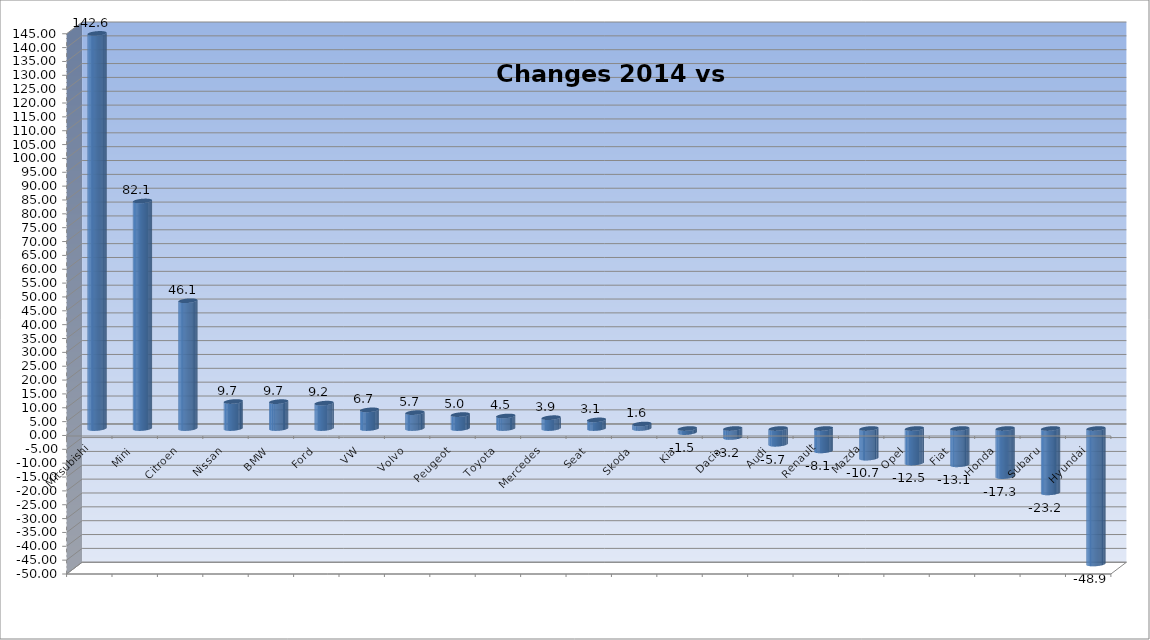
| Category | Ytd 2015 |
|---|---|
| Mitsubishi | 142.623 |
| Mini | 82.143 |
| Citroen | 46.127 |
| Nissan | 9.746 |
| BMW | 9.709 |
| Ford | 9.164 |
| VW | 6.744 |
| Volvo | 5.744 |
| Peugeot | 5.036 |
| Toyota | 4.534 |
| Mercedes | 3.917 |
| Seat | 3.118 |
| Skoda | 1.634 |
| Kia | -1.456 |
| Dacia | -3.226 |
| Audi | -5.687 |
| Renault | -8.068 |
| Mazda | -10.674 |
| Opel | -12.455 |
| Fiat | -13.091 |
| Honda | -17.341 |
| Subaru | -23.218 |
| Hyundai | -48.882 |